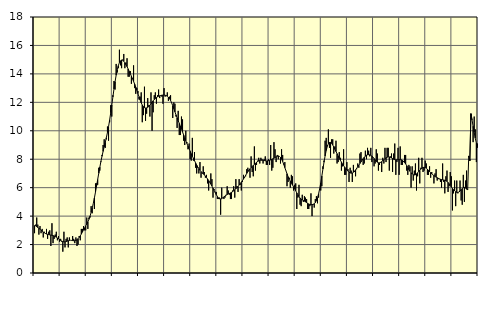
| Category | Piggar | Series 1 |
|---|---|---|
| nan | 2.8 | 3.33 |
| 87.0 | 3.4 | 3.32 |
| 87.0 | 3.9 | 3.26 |
| 87.0 | 3.4 | 3.2 |
| 87.0 | 2.7 | 3.15 |
| 87.0 | 3.3 | 3.08 |
| 87.0 | 2.8 | 3.01 |
| 87.0 | 3.1 | 2.94 |
| 87.0 | 2.5 | 2.88 |
| 87.0 | 2.9 | 2.83 |
| 87.0 | 2.8 | 2.78 |
| 87.0 | 3.1 | 2.74 |
| nan | 2.4 | 2.72 |
| 88.0 | 2.9 | 2.7 |
| 88.0 | 3 | 2.68 |
| 88.0 | 1.9 | 2.67 |
| 88.0 | 3.5 | 2.65 |
| 88.0 | 2.1 | 2.63 |
| 88.0 | 2.4 | 2.6 |
| 88.0 | 2.7 | 2.56 |
| 88.0 | 2.9 | 2.52 |
| 88.0 | 2.3 | 2.46 |
| 88.0 | 2.6 | 2.41 |
| 88.0 | 2.2 | 2.35 |
| nan | 2.4 | 2.29 |
| 89.0 | 2.2 | 2.25 |
| 89.0 | 1.5 | 2.21 |
| 89.0 | 2.9 | 2.19 |
| 89.0 | 1.8 | 2.19 |
| 89.0 | 2.4 | 2.21 |
| 89.0 | 2.5 | 2.24 |
| 89.0 | 1.8 | 2.27 |
| 89.0 | 2.5 | 2.29 |
| 89.0 | 2.3 | 2.3 |
| 89.0 | 2.3 | 2.29 |
| 89.0 | 2.6 | 2.28 |
| nan | 2.4 | 2.27 |
| 90.0 | 2.1 | 2.27 |
| 90.0 | 2.5 | 2.29 |
| 90.0 | 1.9 | 2.34 |
| 90.0 | 2 | 2.41 |
| 90.0 | 2.6 | 2.5 |
| 90.0 | 2.3 | 2.61 |
| 90.0 | 3.1 | 2.74 |
| 90.0 | 3.1 | 2.88 |
| 90.0 | 3.3 | 3.03 |
| 90.0 | 3 | 3.17 |
| 90.0 | 3 | 3.31 |
| nan | 3.9 | 3.45 |
| 91.0 | 3.1 | 3.6 |
| 91.0 | 3.9 | 3.78 |
| 91.0 | 3.9 | 4 |
| 91.0 | 4.7 | 4.26 |
| 91.0 | 4.2 | 4.56 |
| 91.0 | 4.9 | 4.9 |
| 91.0 | 4.5 | 5.28 |
| 91.0 | 6.3 | 5.69 |
| 91.0 | 6.3 | 6.12 |
| 91.0 | 6.2 | 6.57 |
| 91.0 | 7.4 | 7.01 |
| nan | 7.2 | 7.44 |
| 92.0 | 7.8 | 7.85 |
| 92.0 | 8.3 | 8.21 |
| 92.0 | 9 | 8.55 |
| 92.0 | 9.4 | 8.87 |
| 92.0 | 8.8 | 9.19 |
| 92.0 | 9.4 | 9.52 |
| 92.0 | 10.3 | 9.88 |
| 92.0 | 9.3 | 10.29 |
| 92.0 | 10.6 | 10.75 |
| 92.0 | 11.8 | 11.27 |
| 92.0 | 11 | 11.81 |
| nan | 12.5 | 12.38 |
| 93.0 | 13.5 | 12.94 |
| 93.0 | 12.9 | 13.45 |
| 93.0 | 14.7 | 13.91 |
| 93.0 | 14.1 | 14.29 |
| 93.0 | 14.4 | 14.58 |
| 93.0 | 15.7 | 14.8 |
| 93.0 | 14.6 | 14.92 |
| 93.0 | 14.4 | 14.97 |
| 93.0 | 15 | 14.96 |
| 93.0 | 15.4 | 14.89 |
| 93.0 | 14.4 | 14.78 |
| nan | 14.8 | 14.65 |
| 94.0 | 15.1 | 14.51 |
| 94.0 | 13.8 | 14.35 |
| 94.0 | 13.8 | 14.18 |
| 94.0 | 14.2 | 14.01 |
| 94.0 | 13.3 | 13.84 |
| 94.0 | 13.7 | 13.66 |
| 94.0 | 14.6 | 13.47 |
| 94.0 | 13 | 13.28 |
| 94.0 | 12.6 | 13.07 |
| 94.0 | 13 | 12.85 |
| 94.0 | 12.8 | 12.62 |
| nan | 12.2 | 12.39 |
| 95.0 | 12.4 | 12.17 |
| 95.0 | 12.7 | 11.97 |
| 95.0 | 10.6 | 11.81 |
| 95.0 | 11.1 | 11.7 |
| 95.0 | 13.1 | 11.63 |
| 95.0 | 10.7 | 11.6 |
| 95.0 | 11.2 | 11.61 |
| 95.0 | 12.3 | 11.65 |
| 95.0 | 11.8 | 11.71 |
| 95.0 | 11 | 11.8 |
| 95.0 | 12.7 | 11.9 |
| nan | 10 | 12.01 |
| 96.0 | 11.3 | 12.11 |
| 96.0 | 12.5 | 12.2 |
| 96.0 | 12.7 | 12.27 |
| 96.0 | 11.9 | 12.34 |
| 96.0 | 12.5 | 12.39 |
| 96.0 | 12.9 | 12.43 |
| 96.0 | 12.3 | 12.46 |
| 96.0 | 12.5 | 12.48 |
| 96.0 | 12.4 | 12.5 |
| 96.0 | 11.9 | 12.51 |
| 96.0 | 13 | 12.51 |
| nan | 12.4 | 12.5 |
| 97.0 | 12.5 | 12.47 |
| 97.0 | 12.7 | 12.43 |
| 97.0 | 12.1 | 12.36 |
| 97.0 | 12.4 | 12.27 |
| 97.0 | 12.5 | 12.13 |
| 97.0 | 12 | 11.96 |
| 97.0 | 10.9 | 11.76 |
| 97.0 | 12 | 11.55 |
| 97.0 | 11.9 | 11.33 |
| 97.0 | 11 | 11.12 |
| 97.0 | 10.2 | 10.91 |
| nan | 11.4 | 10.71 |
| 98.0 | 9.7 | 10.52 |
| 98.0 | 9.7 | 10.32 |
| 98.0 | 11 | 10.13 |
| 98.0 | 10.8 | 9.92 |
| 98.0 | 9.3 | 9.71 |
| 98.0 | 9 | 9.5 |
| 98.0 | 10 | 9.3 |
| 98.0 | 9.2 | 9.11 |
| 98.0 | 8.7 | 8.92 |
| 98.0 | 9.1 | 8.74 |
| 98.0 | 8 | 8.56 |
| nan | 7.9 | 8.39 |
| 99.0 | 9.5 | 8.22 |
| 99.0 | 7.9 | 8.06 |
| 99.0 | 8.5 | 7.9 |
| 99.0 | 7.4 | 7.74 |
| 99.0 | 7 | 7.59 |
| 99.0 | 7.4 | 7.45 |
| 99.0 | 7 | 7.34 |
| 99.0 | 7.8 | 7.23 |
| 99.0 | 6.7 | 7.13 |
| 99.0 | 7 | 7.05 |
| 99.0 | 7.5 | 6.97 |
| nan | 7.1 | 6.9 |
| 0.0 | 6.7 | 6.82 |
| 0.0 | 6.9 | 6.72 |
| 0.0 | 6.3 | 6.61 |
| 0.0 | 5.8 | 6.5 |
| 0.0 | 6.4 | 6.38 |
| 0.0 | 7 | 6.25 |
| 0.0 | 6.6 | 6.11 |
| 0.0 | 5.3 | 5.97 |
| 0.0 | 5.9 | 5.81 |
| 0.0 | 5.7 | 5.66 |
| 0.0 | 5.7 | 5.51 |
| nan | 5.2 | 5.38 |
| 1.0 | 5.2 | 5.28 |
| 1.0 | 5.3 | 5.22 |
| 1.0 | 4.1 | 5.21 |
| 1.0 | 6 | 5.23 |
| 1.0 | 5.3 | 5.29 |
| 1.0 | 5.2 | 5.35 |
| 1.0 | 5.3 | 5.41 |
| 1.0 | 5.5 | 5.47 |
| 1.0 | 6.1 | 5.52 |
| 1.0 | 5.8 | 5.56 |
| 1.0 | 5.5 | 5.59 |
| nan | 5.2 | 5.63 |
| 2.0 | 5.2 | 5.67 |
| 2.0 | 5.8 | 5.72 |
| 2.0 | 6.1 | 5.78 |
| 2.0 | 5.3 | 5.85 |
| 2.0 | 6.6 | 5.92 |
| 2.0 | 6.1 | 6 |
| 2.0 | 5.7 | 6.09 |
| 2.0 | 6.6 | 6.18 |
| 2.0 | 6.2 | 6.28 |
| 2.0 | 5.8 | 6.38 |
| 2.0 | 6.4 | 6.49 |
| nan | 6.9 | 6.61 |
| 3.0 | 6.7 | 6.74 |
| 3.0 | 6.8 | 6.87 |
| 3.0 | 7.3 | 7 |
| 3.0 | 7.4 | 7.12 |
| 3.0 | 7.2 | 7.23 |
| 3.0 | 6.7 | 7.33 |
| 3.0 | 8.2 | 7.41 |
| 3.0 | 7.1 | 7.49 |
| 3.0 | 6.8 | 7.57 |
| 3.0 | 8.9 | 7.64 |
| 3.0 | 7.2 | 7.71 |
| nan | 7.6 | 7.78 |
| 4.0 | 7.9 | 7.84 |
| 4.0 | 8.1 | 7.88 |
| 4.0 | 7.7 | 7.91 |
| 4.0 | 8.1 | 7.93 |
| 4.0 | 8 | 7.93 |
| 4.0 | 7.7 | 7.92 |
| 4.0 | 8 | 7.91 |
| 4.0 | 8.2 | 7.89 |
| 4.0 | 7.6 | 7.88 |
| 4.0 | 7.6 | 7.89 |
| 4.0 | 8 | 7.9 |
| nan | 7.6 | 7.92 |
| 5.0 | 9 | 7.95 |
| 5.0 | 7.2 | 7.99 |
| 5.0 | 7.4 | 8.03 |
| 5.0 | 9.2 | 8.07 |
| 5.0 | 8.7 | 8.12 |
| 5.0 | 7.8 | 8.17 |
| 5.0 | 8.3 | 8.21 |
| 5.0 | 8 | 8.23 |
| 5.0 | 8.2 | 8.2 |
| 5.0 | 7.7 | 8.13 |
| 5.0 | 8.7 | 8.01 |
| nan | 8.3 | 7.84 |
| 6.0 | 7.6 | 7.64 |
| 6.0 | 7.8 | 7.41 |
| 6.0 | 7.2 | 7.19 |
| 6.0 | 6.1 | 6.98 |
| 6.0 | 6.4 | 6.77 |
| 6.0 | 6.7 | 6.6 |
| 6.0 | 6 | 6.45 |
| 6.0 | 6.9 | 6.31 |
| 6.0 | 6.8 | 6.19 |
| 6.0 | 5.8 | 6.06 |
| 6.0 | 6.2 | 5.93 |
| nan | 6.3 | 5.78 |
| 7.0 | 4.5 | 5.63 |
| 7.0 | 5.3 | 5.5 |
| 7.0 | 6.2 | 5.37 |
| 7.0 | 4.8 | 5.27 |
| 7.0 | 4.7 | 5.2 |
| 7.0 | 5.5 | 5.14 |
| 7.0 | 5 | 5.1 |
| 7.0 | 5.4 | 5.05 |
| 7.0 | 5.3 | 5 |
| 7.0 | 5.2 | 4.95 |
| 7.0 | 4.5 | 4.9 |
| nan | 4.5 | 4.85 |
| 8.0 | 4.7 | 4.82 |
| 8.0 | 5.6 | 4.81 |
| 8.0 | 4 | 4.81 |
| 8.0 | 4.8 | 4.82 |
| 8.0 | 4.6 | 4.87 |
| 8.0 | 5.2 | 4.95 |
| 8.0 | 5.4 | 5.09 |
| 8.0 | 4.9 | 5.29 |
| 8.0 | 5.3 | 5.57 |
| 8.0 | 5.9 | 5.92 |
| 8.0 | 5.8 | 6.34 |
| nan | 6.1 | 6.81 |
| 9.0 | 7.5 | 7.31 |
| 9.0 | 7.9 | 7.79 |
| 9.0 | 9.3 | 8.23 |
| 9.0 | 9.5 | 8.61 |
| 9.0 | 9 | 8.9 |
| 9.0 | 10.1 | 9.09 |
| 9.0 | 8.8 | 9.18 |
| 9.0 | 8.1 | 9.18 |
| 9.0 | 9.4 | 9.12 |
| 9.0 | 9.4 | 9 |
| 9.0 | 8.4 | 8.86 |
| nan | 8.9 | 8.7 |
| 10.0 | 9.3 | 8.54 |
| 10.0 | 7.7 | 8.39 |
| 10.0 | 7.8 | 8.23 |
| 10.0 | 8.5 | 8.08 |
| 10.0 | 8.1 | 7.93 |
| 10.0 | 7.2 | 7.8 |
| 10.0 | 7.5 | 7.67 |
| 10.0 | 8.7 | 7.55 |
| 10.0 | 6.9 | 7.44 |
| 10.0 | 6.9 | 7.34 |
| 10.0 | 7.8 | 7.25 |
| nan | 7.3 | 7.16 |
| 11.0 | 6.4 | 7.09 |
| 11.0 | 7.4 | 7.04 |
| 11.0 | 7.2 | 7.02 |
| 11.0 | 6.4 | 7.03 |
| 11.0 | 7.6 | 7.08 |
| 11.0 | 7.1 | 7.16 |
| 11.0 | 6.8 | 7.25 |
| 11.0 | 7.3 | 7.36 |
| 11.0 | 7.7 | 7.47 |
| 11.0 | 7.4 | 7.58 |
| 11.0 | 8.4 | 7.7 |
| nan | 8.5 | 7.81 |
| 12.0 | 8 | 7.93 |
| 12.0 | 7.6 | 8.04 |
| 12.0 | 7.7 | 8.14 |
| 12.0 | 8.6 | 8.22 |
| 12.0 | 8 | 8.28 |
| 12.0 | 8.8 | 8.31 |
| 12.0 | 8.6 | 8.32 |
| 12.0 | 8.2 | 8.31 |
| 12.0 | 8.8 | 8.28 |
| 12.0 | 7.8 | 8.23 |
| 12.0 | 8.1 | 8.14 |
| nan | 7.5 | 8.05 |
| 13.0 | 7.7 | 7.95 |
| 13.0 | 8.7 | 7.85 |
| 13.0 | 8.4 | 7.79 |
| 13.0 | 7.2 | 7.75 |
| 13.0 | 7.6 | 7.75 |
| 13.0 | 7.8 | 7.78 |
| 13.0 | 7.1 | 7.83 |
| 13.0 | 8.1 | 7.89 |
| 13.0 | 7.7 | 7.96 |
| 13.0 | 8.8 | 8.03 |
| 13.0 | 7.8 | 8.1 |
| nan | 8.8 | 8.14 |
| 14.0 | 8.8 | 8.17 |
| 14.0 | 7.2 | 8.16 |
| 14.0 | 8.2 | 8.13 |
| 14.0 | 8.4 | 8.09 |
| 14.0 | 7.1 | 8.05 |
| 14.0 | 8.4 | 8 |
| 14.0 | 9.1 | 7.97 |
| 14.0 | 6.9 | 7.96 |
| 14.0 | 7.8 | 7.96 |
| 14.0 | 8.8 | 7.97 |
| 14.0 | 6.9 | 7.97 |
| nan | 8.9 | 7.97 |
| 15.0 | 7.6 | 7.96 |
| 15.0 | 7.6 | 7.92 |
| 15.0 | 7.8 | 7.86 |
| 15.0 | 8.3 | 7.77 |
| 15.0 | 8.3 | 7.67 |
| 15.0 | 7.2 | 7.55 |
| 15.0 | 6.9 | 7.41 |
| 15.0 | 7.6 | 7.27 |
| 15.0 | 7.5 | 7.15 |
| 15.0 | 6 | 7.04 |
| 15.0 | 7.5 | 6.96 |
| nan | 6.5 | 6.91 |
| 16.0 | 7.2 | 6.89 |
| 16.0 | 7.7 | 6.91 |
| 16.0 | 5.8 | 6.97 |
| 16.0 | 6.8 | 7.04 |
| 16.0 | 8.1 | 7.13 |
| 16.0 | 6.3 | 7.22 |
| 16.0 | 7.4 | 7.3 |
| 16.0 | 8.1 | 7.37 |
| 16.0 | 7.1 | 7.42 |
| 16.0 | 7.2 | 7.43 |
| 16.0 | 7.9 | 7.41 |
| nan | 7.7 | 7.37 |
| 17.0 | 6.9 | 7.3 |
| 17.0 | 6.9 | 7.22 |
| 17.0 | 7.5 | 7.13 |
| 17.0 | 6.7 | 7.05 |
| 17.0 | 7.1 | 6.97 |
| 17.0 | 6.9 | 6.9 |
| 17.0 | 6.3 | 6.85 |
| 17.0 | 7 | 6.79 |
| 17.0 | 7.3 | 6.74 |
| 17.0 | 6.5 | 6.7 |
| 17.0 | 6.6 | 6.66 |
| nan | 6.6 | 6.62 |
| 18.0 | 6.4 | 6.59 |
| 18.0 | 6 | 6.57 |
| 18.0 | 7.7 | 6.55 |
| 18.0 | 6.4 | 6.54 |
| 18.0 | 5.6 | 6.52 |
| 18.0 | 6.8 | 6.49 |
| 18.0 | 7.2 | 6.44 |
| 18.0 | 5.7 | 6.37 |
| 18.0 | 6.1 | 6.27 |
| 18.0 | 7.1 | 6.16 |
| 18.0 | 6.8 | 6.05 |
| nan | 4.4 | 5.95 |
| 19.0 | 5.6 | 5.86 |
| 19.0 | 6.5 | 5.78 |
| 19.0 | 4.7 | 5.71 |
| 19.0 | 6.5 | 5.67 |
| 19.0 | 5.6 | 5.66 |
| 19.0 | 5.7 | 5.7 |
| 19.0 | 6.5 | 5.76 |
| 19.0 | 5.1 | 5.85 |
| 19.0 | 4.8 | 5.94 |
| 19.0 | 6.9 | 6 |
| 19.0 | 5 | 6.02 |
| nan | 6.5 | 5.99 |
| 20.0 | 7.2 | 5.89 |
| 20.0 | 5.9 | 5.86 |
| 20.0 | 8.2 | 8.23 |
| 20.0 | 8 | 7.9 |
| 20.0 | 10.8 | 11.2 |
| 20.0 | 10.8 | 10.77 |
| 20.0 | 9.2 | 10.32 |
| 20.0 | 11 | 9.89 |
| 20.0 | 10.1 | 9.48 |
| 20.0 | 7.8 | 9.13 |
| 20.0 | 9.1 | 8.81 |